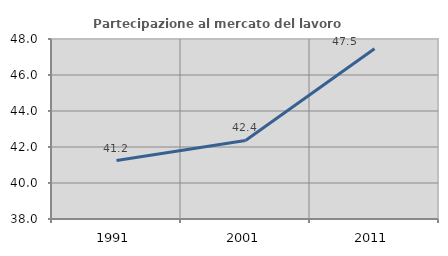
| Category | Partecipazione al mercato del lavoro  femminile |
|---|---|
| 1991.0 | 41.248 |
| 2001.0 | 42.363 |
| 2011.0 | 47.453 |